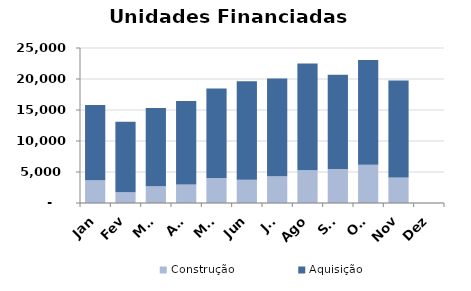
| Category | Construção | Aquisição  |
|---|---|---|
| Jan | 3670 | 12151 |
| Fev | 1732 | 11376 |
| Mar | 2702 | 12625 |
| Abr | 2992 | 13474 |
| Mai | 4049 | 14418 |
| Jun | 3755 | 15900 |
| Jul | 4317 | 15756 |
| Ago | 5270 | 17232 |
| Set | 5497 | 15180 |
| Out | 6177 | 16885 |
| Nov | 4133 | 15644 |
| Dez | 0 | 0 |